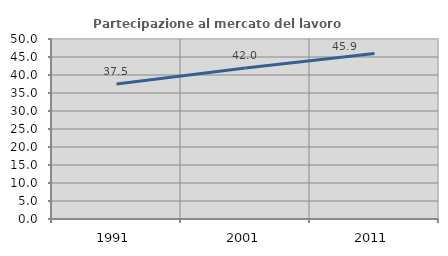
| Category | Partecipazione al mercato del lavoro  femminile |
|---|---|
| 1991.0 | 37.47 |
| 2001.0 | 41.967 |
| 2011.0 | 45.946 |